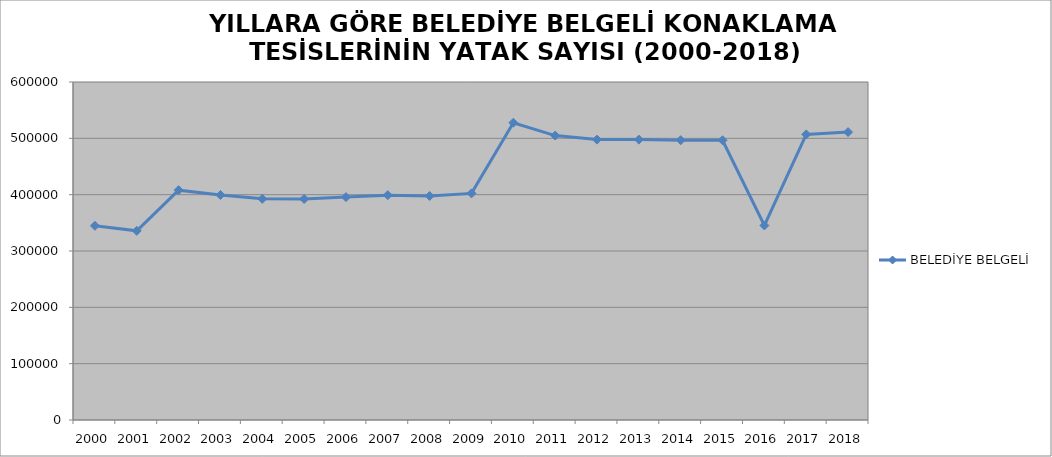
| Category | BELEDİYE BELGELİ |
|---|---|
| 2000 | 344736 |
| 2001 | 335825 |
| 2002 | 408005 |
| 2003 | 399369 |
| 2004 | 392582 |
| 2005 | 392338 |
| 2006 | 395671 |
| 2007 | 399110 |
| 2008 | 397684 |
| 2009 | 402289 |
| 2010 | 527712 |
| 2011 | 504877 |
| 2012 | 497728 |
| 2013 | 497728 |
| 2014 | 496697 |
| 2015 | 496574 |
| 2016 | 345267 |
| 2017 | 506934 |
| 2018 | 511076 |